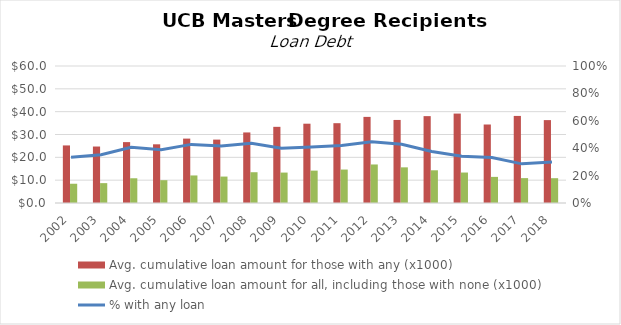
| Category | Avg. cumulative loan amount for those with any (x1000) | Avg. cumulative loan amount for all, including those with none (x1000) |
|---|---|---|
| 2002.0 | 25214.114 | 8434.092 |
| 2003.0 | 24732.403 | 8698.607 |
| 2004.0 | 26666.094 | 10832.176 |
| 2005.0 | 25706.905 | 9988.204 |
| 2006.0 | 28205.822 | 12066.499 |
| 2007.0 | 27765.104 | 11574.289 |
| 2008.0 | 30901.844 | 13477.672 |
| 2009.0 | 33355.714 | 13327.395 |
| 2010.0 | 34730.949 | 14181.804 |
| 2011.0 | 34953.047 | 14649.196 |
| 2012.0 | 37713.221 | 16875.18 |
| 2013.0 | 36372.413 | 15616.063 |
| 2014.0 | 38046.006 | 14322.338 |
| 2015.0 | 39162.454 | 13341.435 |
| 2016.0 | 34378.017 | 11439.057 |
| 2017.0 | 38136.069 | 10896.02 |
| 2018.0 | 36304.401 | 10863.911 |